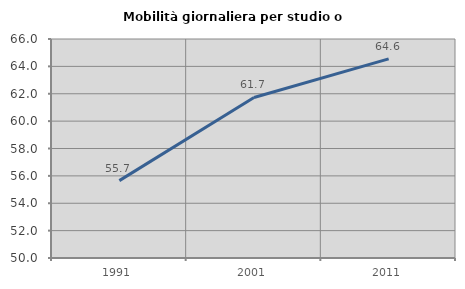
| Category | Mobilità giornaliera per studio o lavoro |
|---|---|
| 1991.0 | 55.654 |
| 2001.0 | 61.727 |
| 2011.0 | 64.551 |